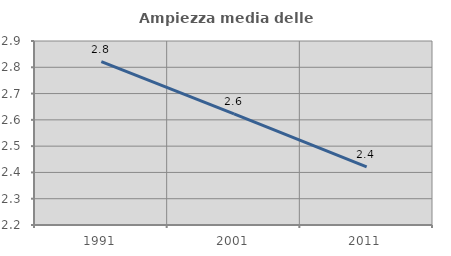
| Category | Ampiezza media delle famiglie |
|---|---|
| 1991.0 | 2.822 |
| 2001.0 | 2.622 |
| 2011.0 | 2.421 |